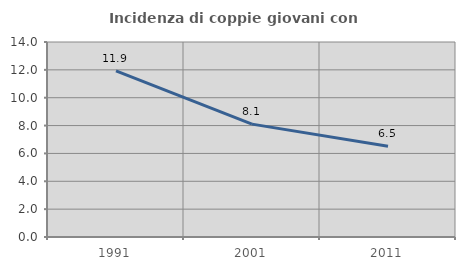
| Category | Incidenza di coppie giovani con figli |
|---|---|
| 1991.0 | 11.921 |
| 2001.0 | 8.104 |
| 2011.0 | 6.509 |